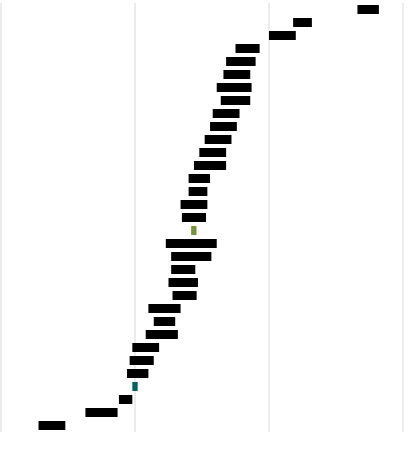
| Category | Series 0 | Series 1 | Series 2 | Series 3 | Series 4 | Series 5 |
|---|---|---|---|---|---|---|
| Corée du Sud | 474 | 71 | 38 | 8 | 0 | 0 |
| Japon | 442 | 78 | 39 | 7 | 0 | 0 |
| Finlande | 429 | 84 | 37 | 10 | 0 | 0 |
| Lettonie | 432 | 70 | 35.5 | 9 | 0 | 0 |
| États-Unis | 387 | 100 | 47 | 11 | 0 | 0 |
| Lituanie | 414 | 77 | 42 | 10 | 0 | 0 |
| Suède | 409 | 81 | 40.5 | 13 | 0 | 0 |
| Angleterre | 413 | 78 | 41 | 11 | 0 | 0 |
| République tchèque | 414 | 76 | 39 | 10 | 0 | 0 |
| Australie | 389 | 96 | 43 | 10 | 0 | 0 |
| Pologne | 401 | 84 | 41 | 10 | 0 | 0 |
| Hongrie | 395 | 83 | 46 | 10 | 0 | 0 |
| Irlande | 393 | 88 | 41 | 12 | 0 | 0 |
| Croatie | 424 | 61 | 35 | 8 | 0 | 0 |
| Canada | 401 | 75 | 44 | 7 | 0 | 0 |
| Autriche | 394 | 81 | 42 | 10 | 0 | 0 |
| Danemark | 405 | 73 | 39.5 | 9 | 0 | 0 |
| Moyenne européenne | 520.95 | 0 | 0 | 2 | 0 | 0 |
| Bulgarie | 326 | 134 | 51.5 | 19 | 0 | 0 |
| République slovaque | 367 | 112 | 34.5 | 15 | 0 | 0 |
| Allemagne | 383 | 85 | 45.5 | 9 | 0 | 0 |
| Pays-Bas | 407 | 69 | 36.5 | 11 | 0 | 0 |
| Irlande du nord | 392 | 81 | 41 | 9 | 0 | 0 |
| Chypre | 381 | 82 | 42 | 12 | 0 | 0 |